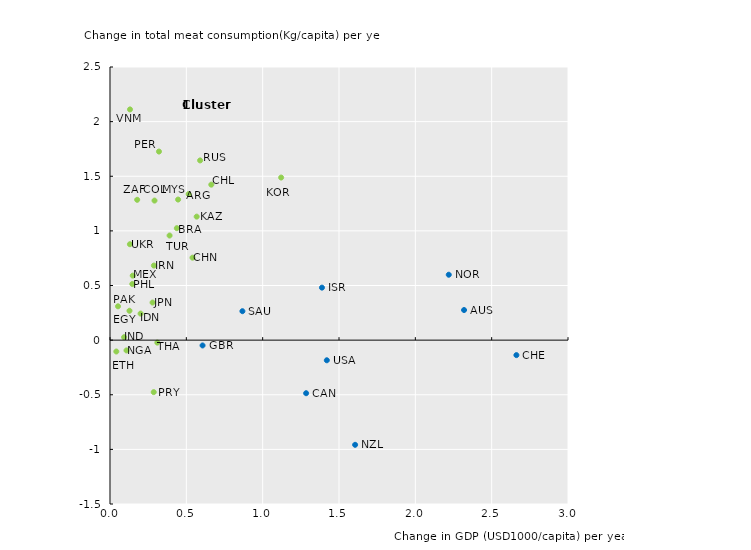
| Category | B_consump |
|---|---|
| 0.5150820534303777 | 1.337 |
| 2.3191449867068563 | 0.275 |
| 0.4377954694502889 | 1.025 |
| 1.2846157720244629 | -0.486 |
| 2.662008556444186 | -0.137 |
| 0.6636007312070967 | 1.423 |
| 0.5405934495683725 | 0.755 |
| 0.2915982576682873 | 1.277 |
| 0.1276365513723884 | 0.269 |
| 0.04141886112950969 | -0.104 |
| 0.6062794516305587 | -0.049 |
| 0.2003788599436392 | 0.243 |
| 0.09229620441484776 | 0.027 |
| 0.2873186733948446 | 0.683 |
| 1.3884413056596725 | 0.48 |
| 0.2788694265223543 | 0.344 |
| 0.5677604086986304 | 1.13 |
| 1.121053474840411 | 1.488 |
| 0.14892324131924203 | 0.59 |
| 0.44598827252125606 | 1.287 |
| 0.10821541616943794 | -0.094 |
| 2.21898061459089 | 0.599 |
| 1.605559918712309 | -0.958 |
| 0.05251599138491164 | 0.31 |
| 0.32076194061500113 | 1.726 |
| 0.14616754543933083 | 0.514 |
| 0.2864595221323183 | -0.476 |
| 0.5902761401346148 | 1.645 |
| 0.867352899468377 | 0.265 |
| 0.3101374269684606 | -0.023 |
| 0.3902460252041226 | 0.957 |
| 0.13040854138632477 | 0.878 |
| 1.4202348751472962 | -0.184 |
| 0.13105781807280562 | 2.112 |
| 0.17810380049653504 | 1.284 |